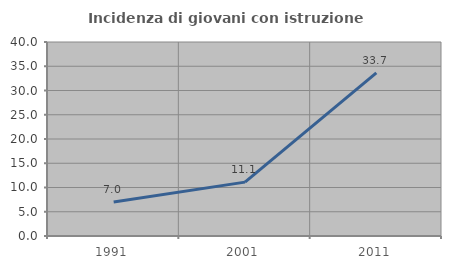
| Category | Incidenza di giovani con istruzione universitaria |
|---|---|
| 1991.0 | 7.009 |
| 2001.0 | 11.111 |
| 2011.0 | 33.654 |